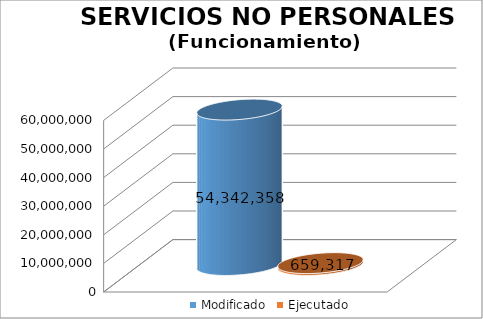
| Category | Modificado | Ejecutado |
|---|---|---|
| 0 | 54342358 | 659316.54 |